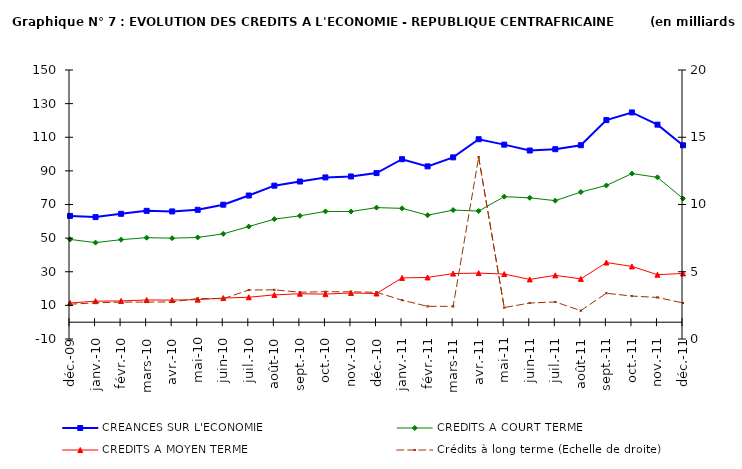
| Category | CREANCES SUR L'ECONOMIE | CREDITS A COURT TERME | CREDITS A MOYEN TERME |
|---|---|---|---|
| 2009-12-04 | 63217 | 49233 | 11401 |
| 2010-01-04 | 62521 | 47324 | 12507 |
| 2010-02-04 | 64461 | 49084 | 12634 |
| 2010-03-04 | 66228 | 50261 | 13221 |
| 2010-04-04 | 65880 | 49973 | 13148 |
| 2010-05-04 | 66837 | 50417 | 13411 |
| 2010-06-04 | 69889 | 52545 | 14345 |
| 2010-07-04 | 75349 | 56878 | 14830 |
| 2010-08-04 | 81201 | 61304 | 16241 |
| 2010-09-04 | 83670 | 63264 | 16926 |
| 2010-10-04 | 86109 | 65894 | 16699 |
| 2010-11-04 | 86688 | 65801 | 17379 |
| 2010-12-04 | 88683 | 68147 | 17062 |
| 2011-01-01 | 96942 | 67709 | 26346 |
| 2011-02-01 | 92678 | 63635 | 26615 |
| 2011-03-01 | 98038 | 66679 | 28933 |
| 2011-04-01 | 108828 | 66114 | 29201 |
| 2011-05-01 | 105610 | 74643 | 28630 |
| 2011-06-01 | 102105 | 73985 | 25446 |
| 2011-07-01 | 102892 | 72280 | 27857 |
| 2011-08-01 | 105246 | 77392 | 25745 |
| 2011-09-01 | 120211 | 81334 | 35475 |
| 2011-10-01 | 124754 | 88375 | 33186 |
| 2011-11-01 | 117500 | 86165 | 28244 |
| 2011-12-01 | 105220 | 73545 | 28997 |